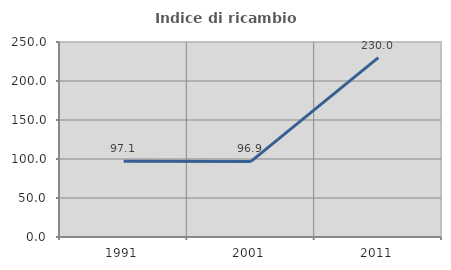
| Category | Indice di ricambio occupazionale  |
|---|---|
| 1991.0 | 97.059 |
| 2001.0 | 96.875 |
| 2011.0 | 230 |